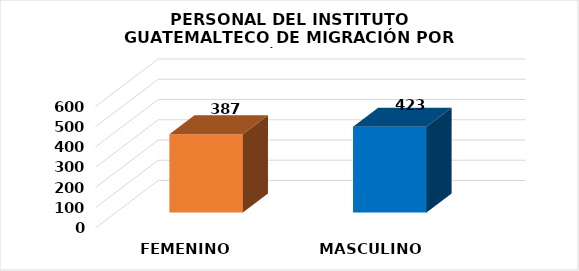
| Category | Series 0 |
|---|---|
| FEMENINO | 387 |
| MASCULINO | 423 |